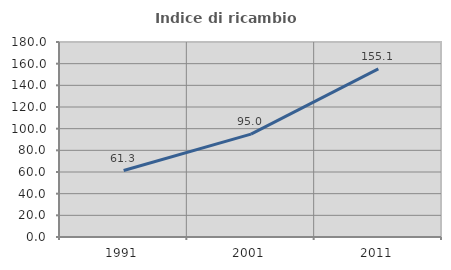
| Category | Indice di ricambio occupazionale  |
|---|---|
| 1991.0 | 61.328 |
| 2001.0 | 95 |
| 2011.0 | 155.146 |